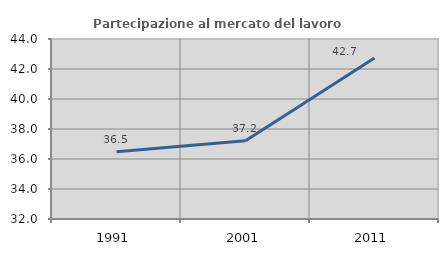
| Category | Partecipazione al mercato del lavoro  femminile |
|---|---|
| 1991.0 | 36.491 |
| 2001.0 | 37.214 |
| 2011.0 | 42.726 |